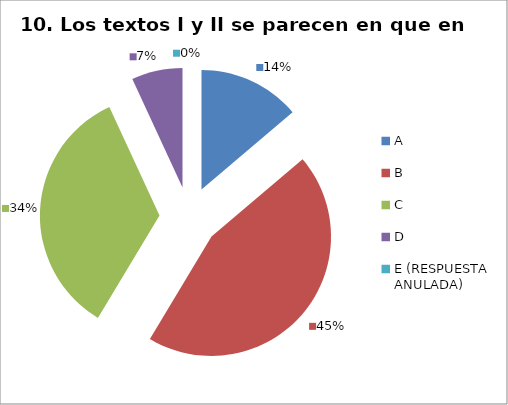
| Category | CANTIDAD DE RESPUESTAS PREGUNTA (10) | PORCENTAJE |
|---|---|---|
| A | 4 | 0.138 |
| B | 13 | 0.448 |
| C | 10 | 0.345 |
| D | 2 | 0.069 |
| E (RESPUESTA ANULADA) | 0 | 0 |